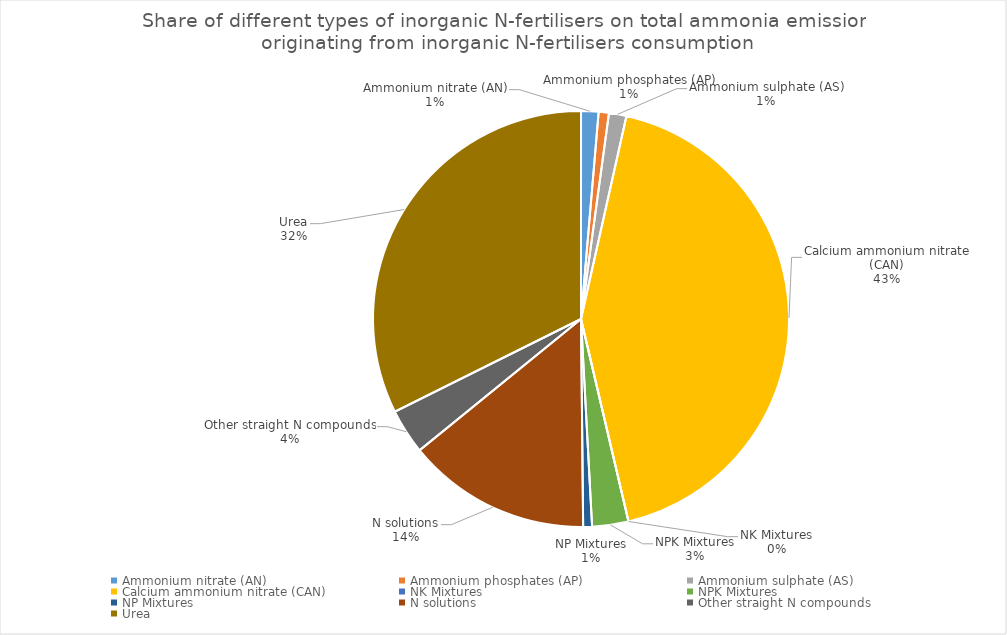
| Category | Series 0 |
|---|---|
| Ammonium nitrate (AN) | 3.455 |
| Ammonium phosphates (AP) | 2.029 |
| Ammonium sulphate (AS) | 3.459 |
| Calcium ammonium nitrate (CAN) | 109.186 |
| NK Mixtures | 0 |
| NPK Mixtures | 7.176 |
| NP Mixtures | 1.748 |
| N solutions | 36.449 |
| Other straight N compounds | 8.961 |
| Urea | 82.5 |